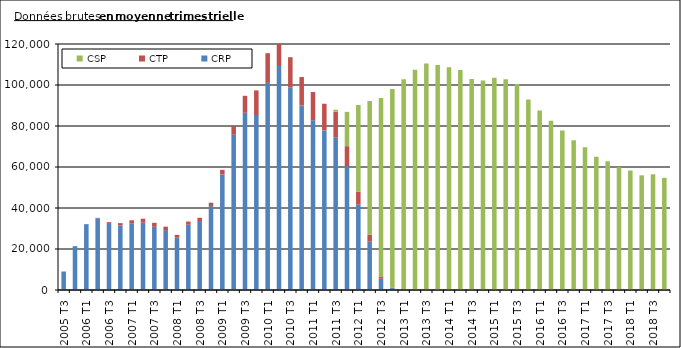
| Category | CRP | CTP | CSP |
|---|---|---|---|
| 2005 T3 | 9020.333 | 0 | 0 |
| 2005 T4 | 21381.333 | 0 | 0 |
| 2006 T1 | 32117.333 | 0 | 0 |
| 2006 T2 | 35008 | 179 | 0 |
| 2006 T3 | 32656.667 | 447.333 | 0 |
| 2006 T4 | 31477 | 1149.667 | 0 |
| 2007 T1 | 32323.333 | 1694.667 | 0 |
| 2007 T2 | 32829.667 | 1949.667 | 0 |
| 2007 T3 | 30817 | 1949.333 | 0 |
| 2007 T4 | 29235.333 | 1653.667 | 0 |
| 2008 T1 | 25532.333 | 1357.667 | 0 |
| 2008 T2 | 31844 | 1551 | 0 |
| 2008 T3 | 33666 | 1562.333 | 0 |
| 2008 T4 | 40932.667 | 1646.333 | 0 |
| 2009 T1 | 56376 | 2227.333 | 0 |
| 2009 T2 | 75718.667 | 4353.667 | 0 |
| 2009 T3 | 86444.333 | 8279.667 | 0 |
| 2009 T4 | 85371 | 11998.333 | 0 |
| 2010 T1 | 101027.667 | 14493 | 0 |
| 2010 T2 | 109272.333 | 15334 | 0 |
| 2010 T3 | 98681.333 | 14871.333 | 0 |
| 2010 T4 | 90039 | 13845 | 0 |
| 2011 T1 | 82795.333 | 13769.667 | 0 |
| 2011 T2 | 77832.667 | 13020.667 | 0 |
| 2011 T3 | 74531 | 12426.667 | 999 |
| 2011 T4 | 60446 | 9703.667 | 16744.667 |
| 2012 T1 | 41607.667 | 6354.667 | 42285.667 |
| 2012 T2 | 23601 | 3366.667 | 65263.333 |
| 2012 T3 | 5506 | 807.333 | 87294.667 |
| 2012 T4 | 954 | 145.333 | 96972.667 |
| 2013 T1 | 367.333 | 35 | 102347.333 |
| 2013 T2 | 183 | 13.667 | 107219 |
| 2013 T3 | 74.667 | 7.333 | 110419.667 |
| 2013 T4 | 52 | 3.667 | 109729 |
| 2014 T1 | 33 | 2 | 108675 |
| 2014 T2 | 10.667 | 1.667 | 107247.333 |
| 2014 T3 | 11 | 0 | 102861.667 |
| 2014 T4 | 7 | 0 | 102240.333 |
| 2015 T1 | 3.667 | 0 | 103504 |
| 2015 T2 | 4.667 | 0 | 102836.333 |
| 2015 T3 | 0 | 0 | 100473 |
| 2015 T4 | 0 | 0 | 92881.333 |
| 2016 T1 | 0 | 0 | 87535.333 |
| 2016 T2 | 0 | 0 | 82508 |
| 2016 T3 | 0 | 0 | 77795.667 |
| 2016 T4 | 0 | 0 | 73004.333 |
| 2017 T1 | 0 | 0 | 69621 |
| 2017 T2 | 0 | 0 | 65030 |
| 2017 T3 | 0 | 0 | 62825 |
| 2017 T4 | 0 | 0 | 59915 |
| 2018 T1 | 0 | 0 | 58279.333 |
| 2018 T2 | 0 | 0 | 55932 |
| 2018 T3 | 0 | 0 | 56455.667 |
| 2018 T4 | 0 | 0 | 54740.333 |